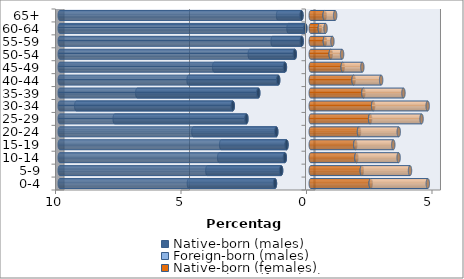
| Category | Native-born (males) | Foreign-born (males) | Native-born (females) | Foreign-born (females) |
|---|---|---|---|---|
| 0-4 | -1.425 | -3.43 | 2.389 | 2.275 |
| 5-9 | -1.181 | -2.939 | 2.034 | 1.921 |
| 10-14 | -1.032 | -2.615 | 1.819 | 1.682 |
| 15-19 | -0.966 | -2.602 | 1.775 | 1.514 |
| 20-24 | -1.374 | -3.303 | 1.922 | 1.584 |
| 25-29 | -2.564 | -5.246 | 2.366 | 2.049 |
| 30-34 | -3.107 | -6.237 | 2.486 | 2.172 |
| 35-39 | -2.091 | -4.821 | 2.097 | 1.596 |
| 40-44 | -1.297 | -3.57 | 1.706 | 1.098 |
| 45-49 | -1.029 | -2.819 | 1.274 | 0.781 |
| 50-54 | -0.635 | -1.795 | 0.797 | 0.452 |
| 55-59 | -0.361 | -1.157 | 0.564 | 0.299 |
| 60-64 | -0.217 | -0.669 | 0.362 | 0.229 |
| 65+ | -0.37 | -0.931 | 0.555 | 0.417 |